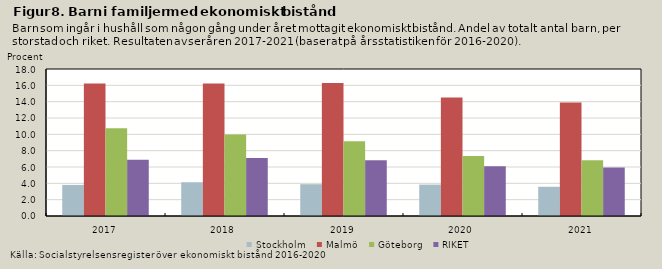
| Category | Stockholm | Malmö | Göteborg | RIKET |
|---|---|---|---|---|
| 2017.0 | 3.806 | 16.224 | 10.758 | 6.9 |
| 2018.0 | 4.133 | 16.216 | 9.965 | 7.114 |
| 2019.0 | 3.893 | 16.288 | 9.141 | 6.826 |
| 2020.0 | 3.843 | 14.523 | 7.348 | 6.097 |
| 2021.0 | 3.579 | 13.892 | 6.827 | 5.941 |